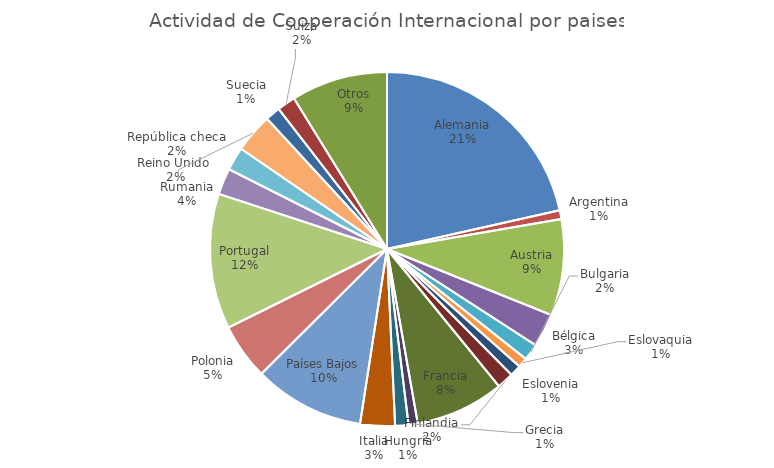
| Category | Nº DE EXPEDIENTES |
|---|---|
| Alemania | 1718 |
| Argentina | 64 |
| Austria | 703 |
| Bélgica | 245 |
| Bulgaria | 121 |
| Eslovaquia | 71 |
| Eslovenia | 83 |
| Finlandia | 122 |
| Francia | 648 |
| Grecia | 67 |
| Hungría | 97 |
| Italia | 253 |
| Países Bajos | 809 |
| Polonia | 410 |
| Portugal | 988 |
| Reino Unido  | 192 |
| República checa | 171 |
| Rumania | 286 |
| Suecia | 109 |
| Suiza | 134 |
| Otros | 704 |